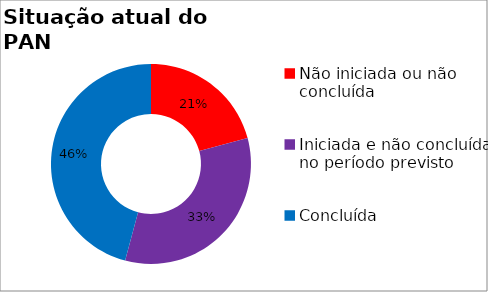
| Category | Series 0 |
|---|---|
| Não iniciada ou não concluída | 0.208 |
| Iniciada e não concluída no período previsto | 0.333 |
| Concluída | 0.458 |